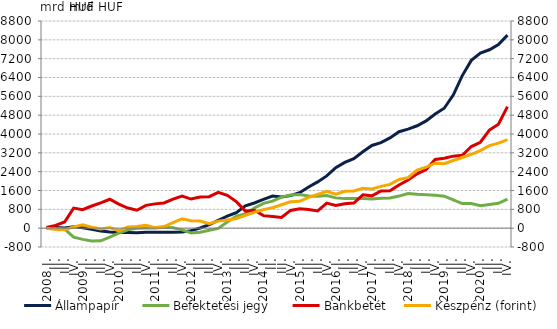
| Category | Állampapír  | Befektetési jegy  |
|---|---|---|
| 2008.I. | 22.215 | 26.165 |
| II. | 32.196 | -14.599 |
| III. | 3.655 | -38.376 |
| IV. | 58.993 | -379.05 |
| 2009.I. | 13.608 | -476.11 |
| II. | -50.936 | -540.979 |
| III. | -124.423 | -536.509 |
| IV. | -166.278 | -380.531 |
| 2010.I. | -187.825 | -213.951 |
| II. | -188.827 | -69.989 |
| III. | -192.032 | -3.064 |
| IV. | -177.74 | 5.307 |
| 2011.I. | -169.063 | 6.968 |
| II. | -175.678 | 38.963 |
| III. | -173.95 | 16.305 |
| IV. | -158.1 | -70.24 |
| 2012.I. | -104.526 | -202.446 |
| II. | 6.445 | -172.071 |
| III. | 148.428 | -89.3 |
| IV. | 326.618 | -10.203 |
| 2013.I. | 512.148 | 263.554 |
| II. | 662.178 | 506.175 |
| III. | 950.434 | 605.191 |
| IV. | 1068.977 | 855.499 |
| 2014.I. | 1219.915 | 1052.584 |
| II. | 1364.507 | 1146.502 |
| III. | 1327.264 | 1319.592 |
| IV. | 1382.463 | 1405.957 |
| 2015.I. | 1506.697 | 1429.501 |
| II. | 1746.659 | 1367.25 |
| III. | 1964.404 | 1354.616 |
| IV. | 2218.956 | 1387.636 |
| 2016.I. | 2567.788 | 1286.835 |
| II. | 2790.9 | 1254.977 |
| III. | 2955.272 | 1264.915 |
| IV. | 3246.51 | 1263.371 |
| 2017.I. | 3513.983 | 1237.205 |
| II. | 3631.932 | 1274.329 |
| III. | 3835.071 | 1280.221 |
| IV. | 4097.594 | 1362.986 |
| 2018.I. | 4208.093 | 1468.716 |
| II. | 4349.674 | 1436.507 |
| III. | 4554.519 | 1424.291 |
| IV. | 4852.016 | 1401.376 |
| 2019.I. | 5093.52 | 1360.1 |
| II. | 5651.77 | 1201.787 |
| III. | 6480.707 | 1042.711 |
| IV. | 7127.734 | 1043.548 |
| 2020.I. | 7434.469 | 951.007 |
| II. | 7578.059 | 1008.585 |
| III. | 7796.174 | 1058.738 |
| IV. | 8200.613 | 1233.009 |